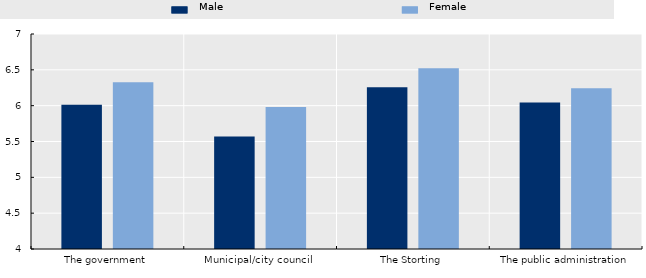
| Category | Male | Female |
|---|---|---|
| The government | 6.014 | 6.325 |
| Municipal/city council | 5.571 | 5.98 |
| The Storting | 6.257 | 6.522 |
| The public administration | 6.043 | 6.243 |